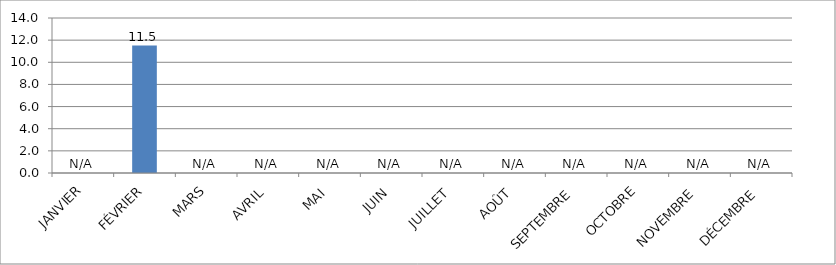
| Category | Series 0 |
|---|---|
| JANVIER | 0 |
| FÉVRIER | 11.507 |
| MARS | 0 |
| AVRIL | 0 |
| MAI | 0 |
| JUIN | 0 |
| JUILLET | 0 |
| AOÛT | 0 |
| SEPTEMBRE | 0 |
| OCTOBRE | 0 |
| NOVEMBRE | 0 |
| DÉCEMBRE | 0 |